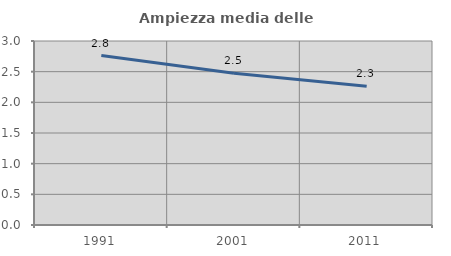
| Category | Ampiezza media delle famiglie |
|---|---|
| 1991.0 | 2.763 |
| 2001.0 | 2.475 |
| 2011.0 | 2.263 |